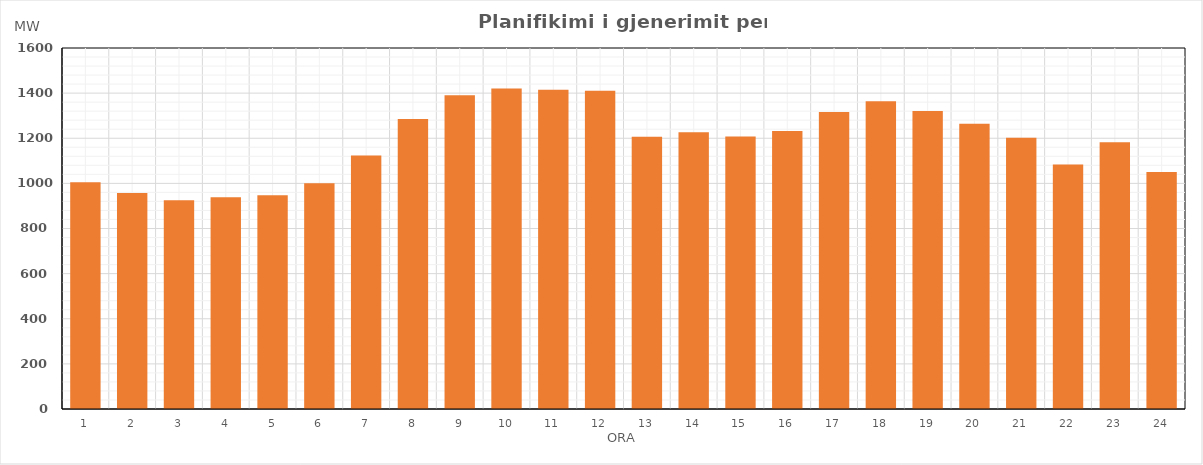
| Category | Max (MW) |
|---|---|
| 0 | 1004.947 |
| 1 | 957.668 |
| 2 | 925.534 |
| 3 | 938.545 |
| 4 | 947.56 |
| 5 | 1000.896 |
| 6 | 1123.582 |
| 7 | 1285.62 |
| 8 | 1390.358 |
| 9 | 1420.497 |
| 10 | 1415.383 |
| 11 | 1410.151 |
| 12 | 1206.924 |
| 13 | 1227.029 |
| 14 | 1207.871 |
| 15 | 1231.781 |
| 16 | 1316.257 |
| 17 | 1364.019 |
| 18 | 1320.326 |
| 19 | 1264.038 |
| 20 | 1202.503 |
| 21 | 1083.928 |
| 22 | 1182.366 |
| 23 | 1050.792 |